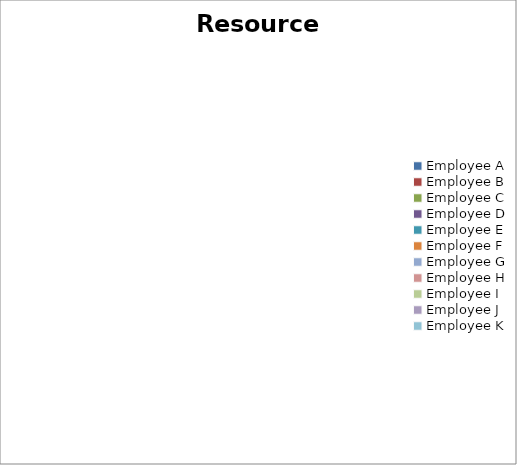
| Category | data |
|---|---|
| Employee A | 0 |
| Employee B | 0 |
| Employee C | 0 |
| Employee D | 0 |
| Employee E | 0 |
| Employee F | 0 |
| Employee G | 0 |
| Employee H | 0 |
| Employee I | 0 |
| Employee J | 0 |
| Employee K | 0 |